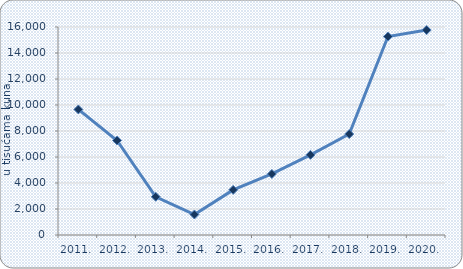
| Category | Neto dobit/gubitak |
|---|---|
| 2011. | 9660.586 |
| 2012. | 7269.983 |
| 2013. | 2941.994 |
| 2014. | 1573.345 |
| 2015. | 3469.946 |
| 2016. | 4698.655 |
| 2017. | 6164.85 |
| 2018. | 7767.828 |
| 2019. | 15265.427 |
| 2020. | 15762.607 |